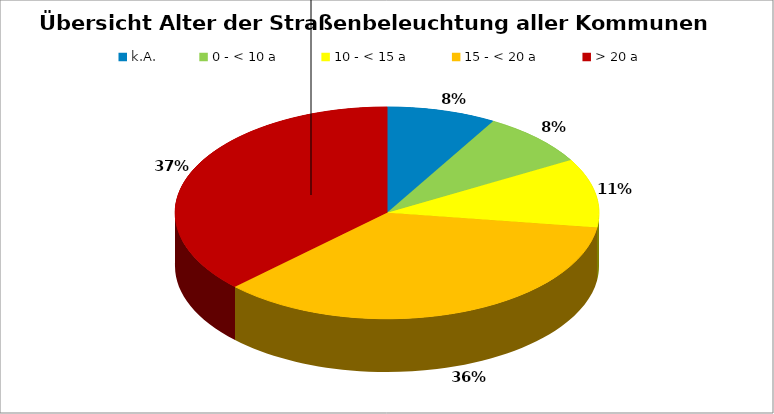
| Category | Series 0 |
|---|---|
| k.A. | 19 |
| 0 - < 10 a | 19 |
| 10 - < 15 a | 24 |
| 15 - < 20 a | 81 |
| > 20 a | 85 |